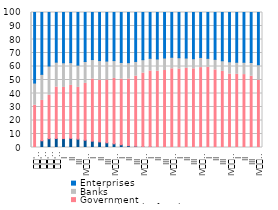
| Category | National Bank of Serbia | Government | Banks | Enterprises |
|---|---|---|---|---|
| 
'08 | 0 | 31.291 | 16.447 | 52.262 |
| 
'09 | 4.984 | 29.887 | 19.325 | 45.804 |
| 
'10 | 6.503 | 32.179 | 21.652 | 39.665 |
| 
'11 | 6.706 | 38.066 | 18.448 | 36.78 |
| I | 6.602 | 37.888 | 18.27 | 37.24 |
| II | 6.814 | 39.174 | 16.883 | 37.129 |
| III | 6.204 | 38.335 | 16.474 | 38.987 |
| IV
2012 | 5.415 | 42.098 | 16.181 | 36.306 |
| I | 4.685 | 46.019 | 14.432 | 34.864 |
| II | 4.172 | 45.685 | 14.545 | 35.598 |
| III | 3.477 | 46.517 | 14.026 | 35.98 |
| IV
2013 | 2.719 | 48.441 | 13.222 | 35.619 |
| I | 2.021 | 48.661 | 12.328 | 36.99 |
| II | 1.323 | 49.383 | 12.132 | 37.162 |
| III | 0.944 | 51.893 | 10.911 | 36.253 |
| IV
2014 | 0.591 | 54.493 | 9.967 | 34.949 |
| I | 0.407 | 56.273 | 9.408 | 33.912 |
| II | 0.194 | 56.26 | 9.127 | 34.418 |
| III | 0.112 | 56.908 | 9.265 | 33.715 |
| IV
2015 | 0.056 | 58.247 | 8.549 | 33.148 |
| I | 0.028 | 58.122 | 8.368 | 33.482 |
| II | 0 | 58.669 | 7.611 | 33.72 |
| III | 0 | 58.285 | 7.49 | 34.225 |
| IV
2016 | 0 | 59.181 | 7.541 | 33.278 |
| I | 0 | 59.435 | 6.62 | 33.944 |
| II | 0 | 57.473 | 7.843 | 34.684 |
| III | 0 | 56.361 | 7.899 | 35.74 |
| IV
2017 | 0 | 54.384 | 9.131 | 36.485 |
| I | 0 | 54.218 | 8.929 | 36.854 |
| II | 0 | 54.004 | 9.148 | 36.848 |
| III | 0 | 52.771 | 10.203 | 37.027 |
| IV
2018 | 0 | 49.898 | 11.402 | 38.699 |